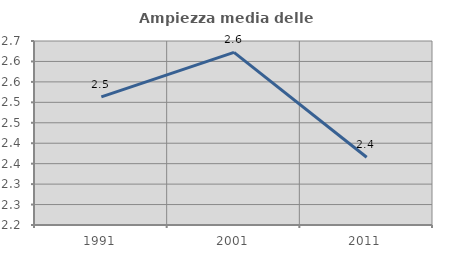
| Category | Ampiezza media delle famiglie |
|---|---|
| 1991.0 | 2.513 |
| 2001.0 | 2.622 |
| 2011.0 | 2.366 |